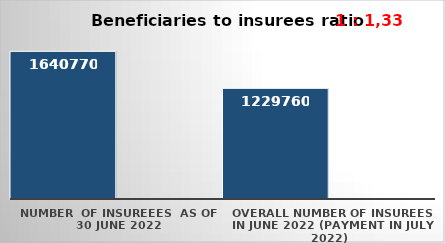
| Category | Series 0 | Series 1 |
|---|---|---|
| NUMBER  of insureees  as of  30 June 2022 | 1640770 |  |
| OVERALL number of insurees in June 2022 (payment in July 2022) | 1229760 |  |